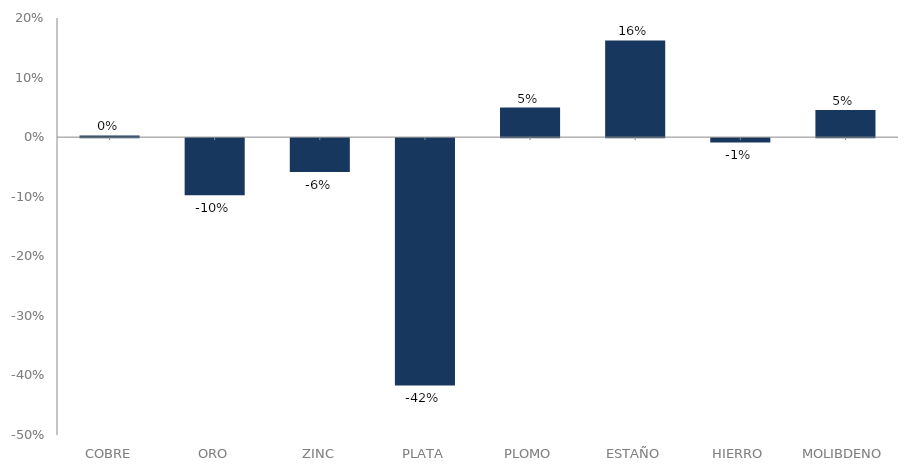
| Category | serie |
|---|---|
| 0 | 0.003 |
| 1 | -0.096 |
| 2 | -0.057 |
| 3 | -0.415 |
| 4 | 0.05 |
| 5 | 0.162 |
| 6 | -0.007 |
| 7 | 0.046 |